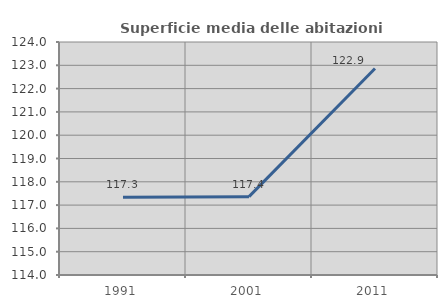
| Category | Superficie media delle abitazioni occupate |
|---|---|
| 1991.0 | 117.339 |
| 2001.0 | 117.363 |
| 2011.0 | 122.862 |